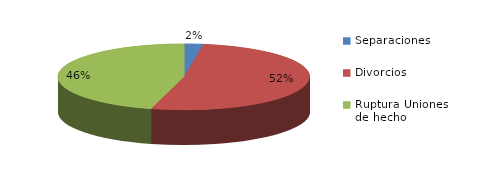
| Category | Series 0 |
|---|---|
| Separaciones | 16 |
| Divorcios | 341 |
| Ruptura Uniones de hecho | 302 |